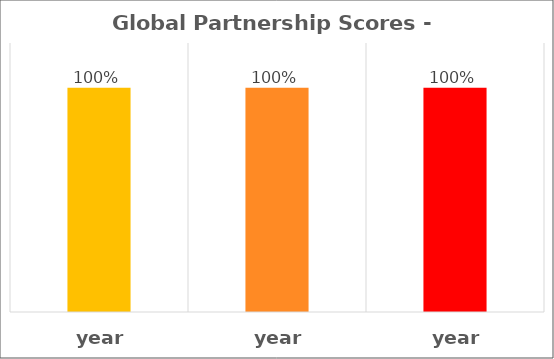
| Category | Global  |
|---|---|
| year | 1 |
| year | 1 |
| year | 1 |